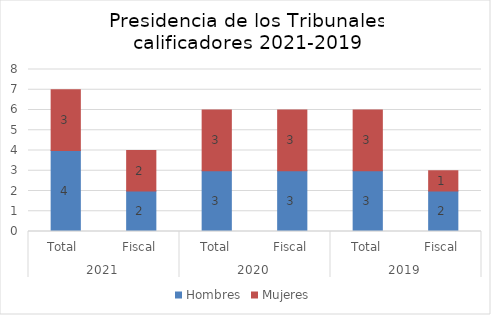
| Category | Hombres | Mujeres |
|---|---|---|
| 0 | 4 | 3 |
| 1 | 2 | 2 |
| 2 | 3 | 3 |
| 3 | 3 | 3 |
| 4 | 3 | 3 |
| 5 | 2 | 1 |